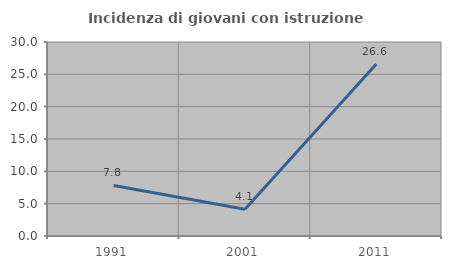
| Category | Incidenza di giovani con istruzione universitaria |
|---|---|
| 1991.0 | 7.812 |
| 2001.0 | 4.132 |
| 2011.0 | 26.596 |